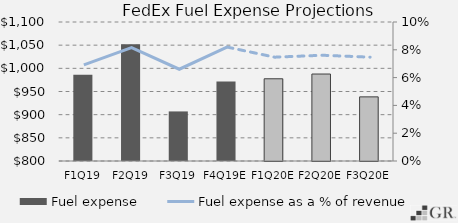
| Category | Fuel expense |
|---|---|
|  F1Q19  | 986 |
|  F2Q19  | 1052 |
|  F3Q19  | 907 |
|  F4Q19E  | 971.81 |
|  F1Q20E  | 977.465 |
|  F2Q20E  | 987.711 |
|  F3Q20E  | 938.407 |